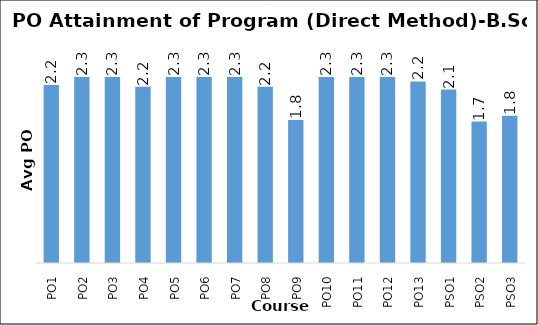
| Category | Avg. PO |
|---|---|
| PO1 | 2.191 |
| PO2 | 2.289 |
| PO3 | 2.289 |
| PO4 | 2.172 |
| PO5 | 2.289 |
| PO6 | 2.289 |
| PO7 | 2.289 |
| PO8 | 2.172 |
| PO9 | 1.76 |
| PO10 | 2.289 |
| PO11 | 2.289 |
| PO12 | 2.289 |
| PO13 | 2.237 |
| PSO1 | 2.136 |
| PSO2 | 1.741 |
| PSO3 | 1.814 |